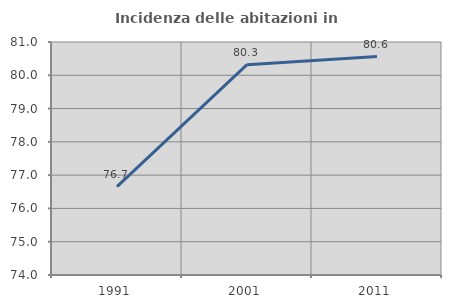
| Category | Incidenza delle abitazioni in proprietà  |
|---|---|
| 1991.0 | 76.656 |
| 2001.0 | 80.319 |
| 2011.0 | 80.562 |